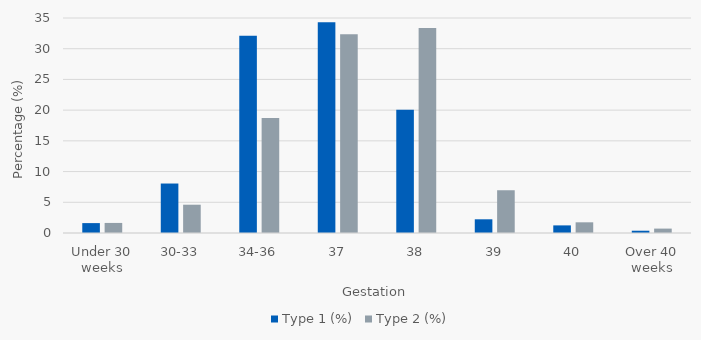
| Category | Type 1 (%) | Type 2 (%) |
|---|---|---|
| Under 30 weeks | 1.611 | 1.638 |
| 30-33 | 8.055 | 4.606 |
| 34-36 | 32.094 | 18.731 |
| 37 | 34.325 | 32.344 |
| 38 | 20.074 | 33.367 |
| 39 | 2.23 | 6.96 |
| 40 | 1.239 | 1.74 |
| Over 40 weeks | 0.372 | 0.716 |